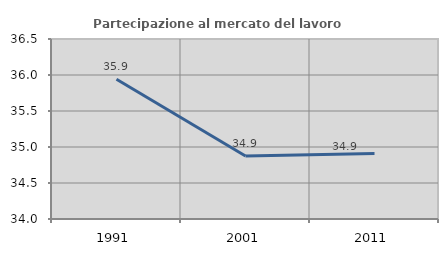
| Category | Partecipazione al mercato del lavoro  femminile |
|---|---|
| 1991.0 | 35.94 |
| 2001.0 | 34.876 |
| 2011.0 | 34.909 |